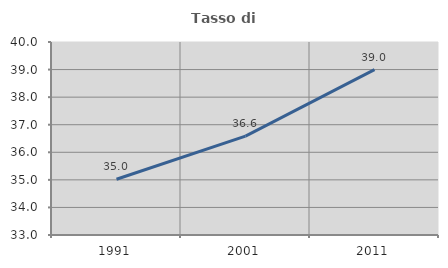
| Category | Tasso di occupazione   |
|---|---|
| 1991.0 | 35.021 |
| 2001.0 | 36.585 |
| 2011.0 | 38.997 |